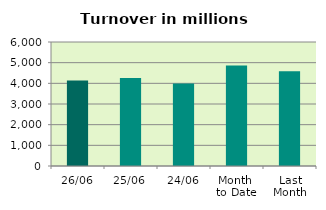
| Category | Series 0 |
|---|---|
| 26/06 | 4139.982 |
| 25/06 | 4256.417 |
| 24/06 | 3990.88 |
| Month 
to Date | 4867.274 |
| Last
Month | 4586.899 |